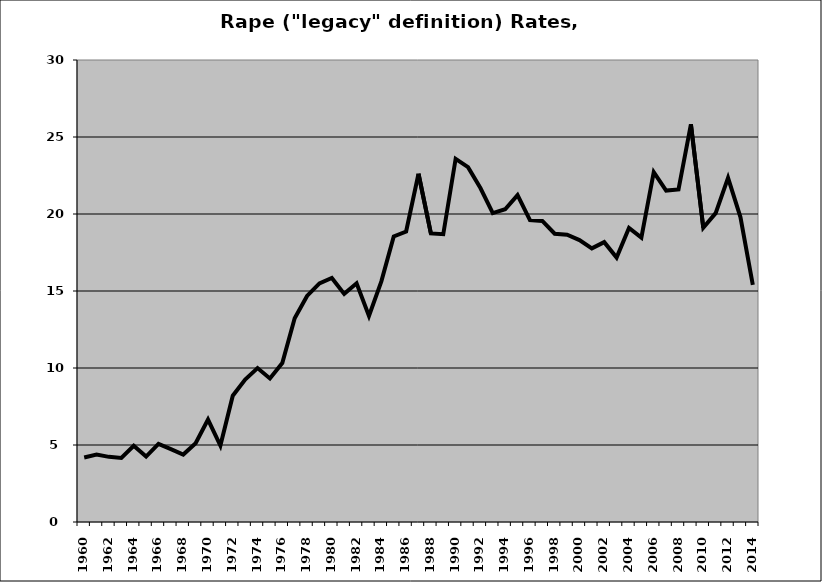
| Category | Rape |
|---|---|
| 1960.0 | 4.193 |
| 1961.0 | 4.378 |
| 1962.0 | 4.23 |
| 1963.0 | 4.162 |
| 1964.0 | 4.953 |
| 1965.0 | 4.249 |
| 1966.0 | 5.072 |
| 1967.0 | 4.727 |
| 1968.0 | 4.377 |
| 1969.0 | 5.113 |
| 1970.0 | 6.65 |
| 1971.0 | 4.966 |
| 1972.0 | 8.198 |
| 1973.0 | 9.253 |
| 1974.0 | 9.994 |
| 1975.0 | 9.318 |
| 1976.0 | 10.324 |
| 1977.0 | 13.233 |
| 1978.0 | 14.677 |
| 1979.0 | 15.495 |
| 1980.0 | 15.848 |
| 1981.0 | 14.813 |
| 1982.0 | 15.503 |
| 1983.0 | 13.384 |
| 1984.0 | 15.625 |
| 1985.0 | 18.543 |
| 1986.0 | 18.864 |
| 1987.0 | 22.615 |
| 1988.0 | 18.737 |
| 1989.0 | 18.686 |
| 1990.0 | 23.585 |
| 1991.0 | 23.043 |
| 1992.0 | 21.689 |
| 1993.0 | 20.055 |
| 1994.0 | 20.307 |
| 1995.0 | 21.225 |
| 1996.0 | 19.606 |
| 1997.0 | 19.548 |
| 1998.0 | 18.719 |
| 1999.0 | 18.65 |
| 2000.0 | 18.304 |
| 2001.0 | 17.768 |
| 2002.0 | 18.173 |
| 2003.0 | 17.169 |
| 2004.0 | 19.089 |
| 2005.0 | 18.467 |
| 2006.0 | 22.711 |
| 2007.0 | 21.523 |
| 2008.0 | 21.599 |
| 2009.0 | 25.827 |
| 2010.0 | 19.104 |
| 2011.0 | 20.055 |
| 2012.0 | 22.352 |
| 2013.0 | 19.799 |
| 2014.0 | 15.403 |